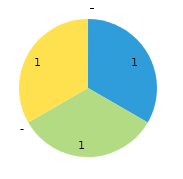
| Category | Monday | Department |
|---|---|---|
| 0 | 1 | 0 |
| 1 | 1 | 0 |
| 2 | 0 | 0 |
| 3 | 0 | 0 |
| 4 | 1 | 0 |
| 5 | 0 | 0 |
| 6 | 0 | 0 |
| 7 | 0 | 0 |
| 8 | 0 | 0 |
| 9 | 0 | 0 |
| 10 | 0 | 0 |
| 11 | 0 | 0 |
| 12 | 0 | 0 |
| 13 | 0 | 0 |
| 14 | 0 | 0 |
| 15 | 0 | 0 |
| 16 | 0 | 0 |
| 17 | 0 | 0 |
| 18 | 0 | 0 |
| 19 | 0 | 0 |